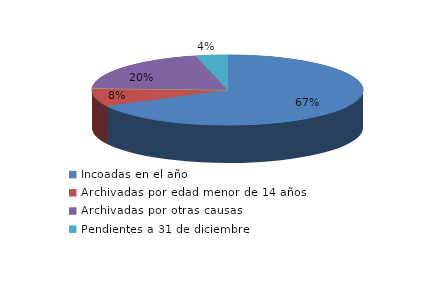
| Category | Series 0 |
|---|---|
| Incoadas en el año | 339 |
| Archivadas por edad menor de 14 años | 42 |
| Archivadas por desistimiento de incoación (art. 18) | 0 |
| Archivadas por otras causas | 103 |
| Pendientes a 31 de diciembre | 19 |